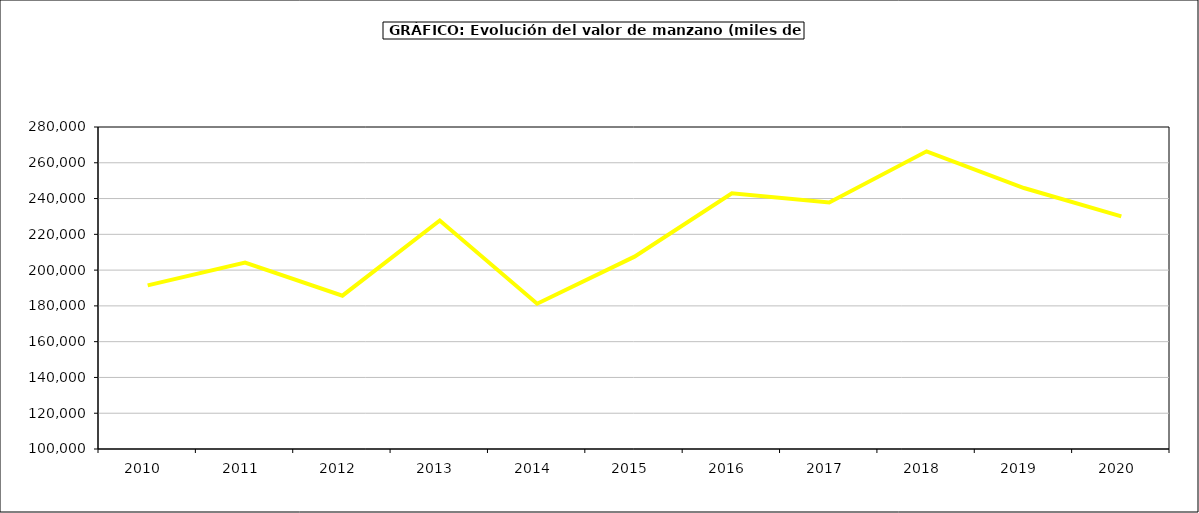
| Category | valor manzano |
|---|---|
| 2010.0 | 191488.023 |
| 2011.0 | 204168.506 |
| 2012.0 | 185703.956 |
| 2013.0 | 227733.263 |
| 2014.0 | 181209.741 |
| 2015.0 | 207515 |
| 2016.0 | 242923 |
| 2017.0 | 237842.719 |
| 2018.0 | 266393.145 |
| 2019.0 | 245889.131 |
| 2020.0 | 230039.865 |